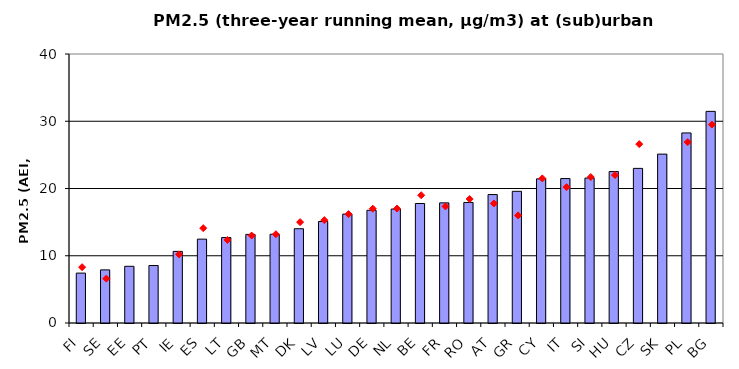
| Category | Series 0 |
|---|---|
| FI | 7.419 |
| SE | 7.899 |
| EE | 8.431 |
| PT | 8.545 |
| IE | 10.648 |
| ES | 12.472 |
| LT | 12.709 |
| GB | 13.178 |
| MT | 13.197 |
| DK | 14.019 |
| LV | 15.097 |
| LU | 16.192 |
| DE | 16.761 |
| NL | 16.944 |
| BE | 17.77 |
| FR | 17.864 |
| RO | 17.925 |
| AT | 19.099 |
| GR | 19.583 |
| CY | 21.432 |
| IT | 21.476 |
| SI | 21.554 |
| HU | 22.52 |
| CZ | 22.991 |
| SK | 25.112 |
| PL | 28.26 |
| BG | 31.47 |